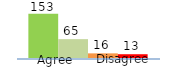
| Category | Series 0 | Series 1 | Series 2 | Series 3 |
|---|---|---|---|---|
| 0 | 153 | 65 | 16 | 13 |